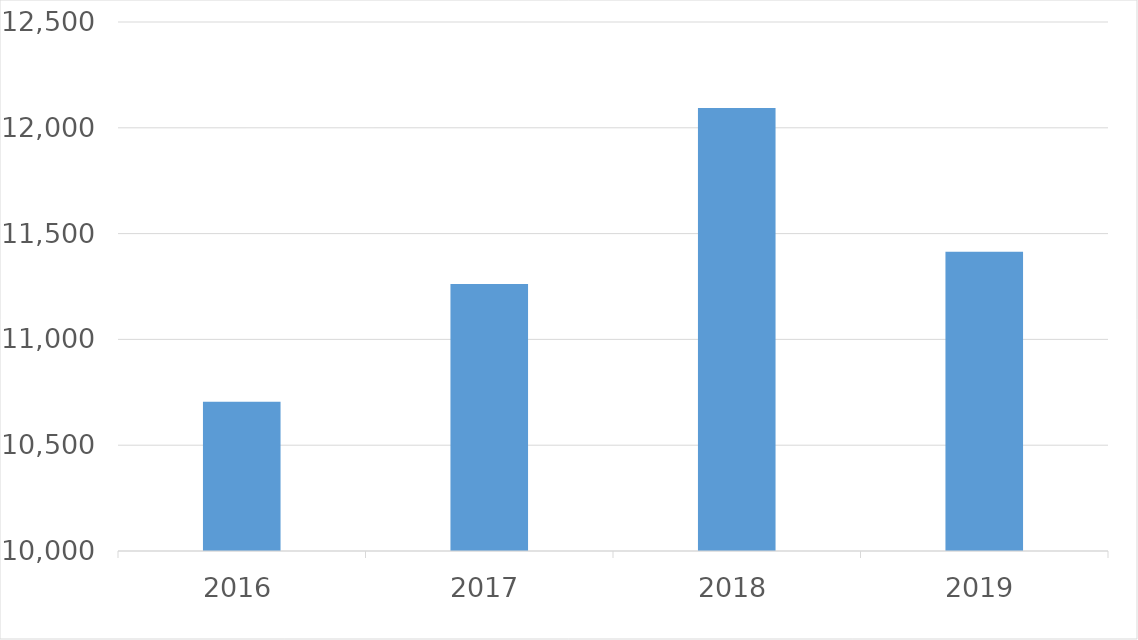
| Category | Series 0 |
|---|---|
| 2016 | 10705 |
| 2017 | 11262 |
| 2018 | 12093 |
| 2019 | 11414 |